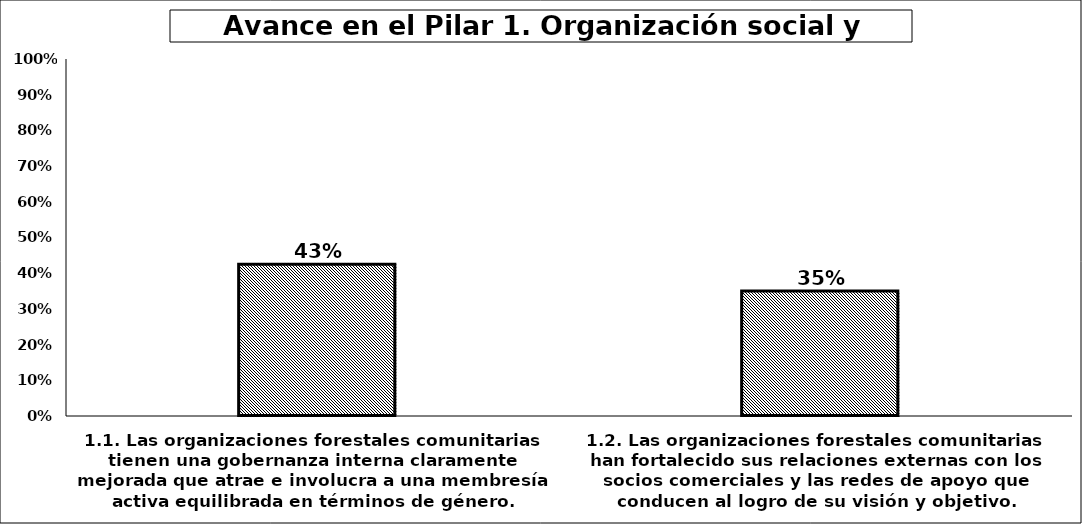
| Category | Series 6 |
|---|---|
| 1.1. Las organizaciones forestales comunitarias tienen una gobernanza interna claramente mejorada que atrae e involucra a una membresía activa equilibrada en términos de género. | 0.425 |
| 1.2. Las organizaciones forestales comunitarias han fortalecido sus relaciones externas con los socios comerciales y las redes de apoyo que conducen al logro de su visión y objetivo. | 0.35 |